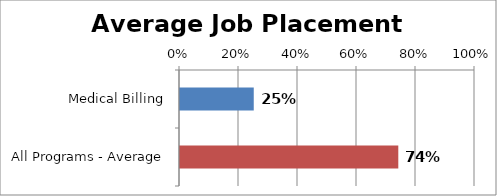
| Category | Series 0 |
|---|---|
| Medical Billing | 0.25 |
| All Programs - Average | 0.74 |